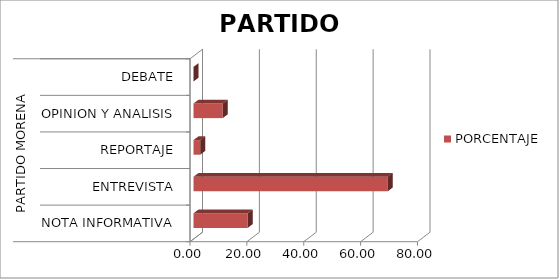
| Category | PORCENTAJE |
|---|---|
| 0 | 19.055 |
| 1 | 68.314 |
| 2 | 2.361 |
| 3 | 10.269 |
| 4 | 0 |